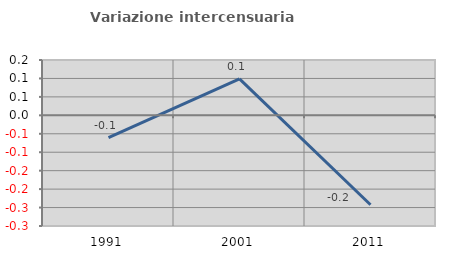
| Category | Variazione intercensuaria annua |
|---|---|
| 1991.0 | -0.06 |
| 2001.0 | 0.099 |
| 2011.0 | -0.242 |